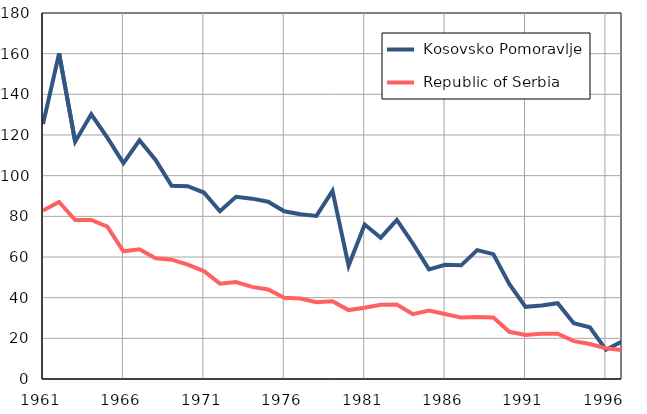
| Category |  Kosovsko Pomoravlje |  Republic of Serbia |
|---|---|---|
| 1961.0 | 125.4 | 82.9 |
| 1962.0 | 160.1 | 87.1 |
| 1963.0 | 116.7 | 78.2 |
| 1964.0 | 130.2 | 78.2 |
| 1965.0 | 118.7 | 74.9 |
| 1966.0 | 106.2 | 62.8 |
| 1967.0 | 117.4 | 63.8 |
| 1968.0 | 107.7 | 59.4 |
| 1969.0 | 95 | 58.7 |
| 1970.0 | 94.8 | 56.3 |
| 1971.0 | 91.7 | 53.1 |
| 1972.0 | 82.5 | 46.9 |
| 1973.0 | 89.6 | 47.7 |
| 1974.0 | 88.7 | 45.3 |
| 1975.0 | 87.2 | 44 |
| 1976.0 | 82.5 | 39.9 |
| 1977.0 | 81 | 39.6 |
| 1978.0 | 80.2 | 37.8 |
| 1979.0 | 92.5 | 38.2 |
| 1980.0 | 55.7 | 33.9 |
| 1981.0 | 76 | 35 |
| 1982.0 | 69.5 | 36.5 |
| 1983.0 | 78.2 | 36.6 |
| 1984.0 | 66.6 | 31.9 |
| 1985.0 | 53.9 | 33.7 |
| 1986.0 | 56.2 | 32 |
| 1987.0 | 55.9 | 30.2 |
| 1988.0 | 63.4 | 30.5 |
| 1989.0 | 61.4 | 30.2 |
| 1990.0 | 46.6 | 23.2 |
| 1991.0 | 35.5 | 21.6 |
| 1992.0 | 36.2 | 22.3 |
| 1993.0 | 37.3 | 22.3 |
| 1994.0 | 27.4 | 18.6 |
| 1995.0 | 25.4 | 17.2 |
| 1996.0 | 14.4 | 15.1 |
| 1997.0 | 18.5 | 14.2 |